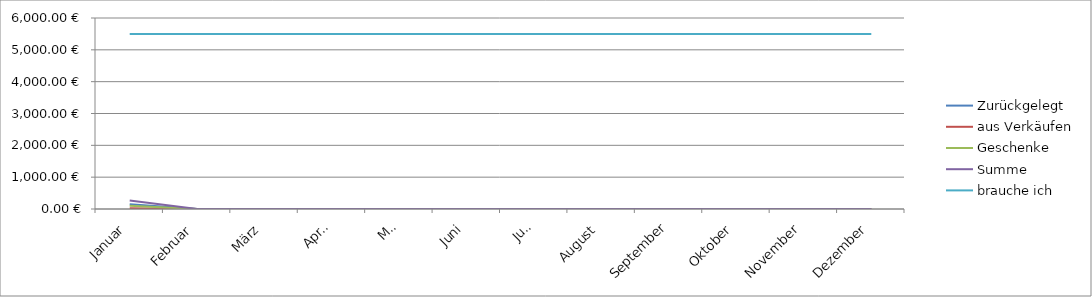
| Category | Zurückgelegt | aus Verkäufen | Geschenke | Summe | brauche ich |
|---|---|---|---|---|---|
| Januar | 150 | 20 | 100 | 270 | 5500 |
| Februar | 0 | 0 | 0 | 0 | 5500 |
| März | 0 | 0 | 0 | 0 | 5500 |
| April | 0 | 0 | 0 | 0 | 5500 |
| Mai | 0 | 0 | 0 | 0 | 5500 |
| Juni | 0 | 0 | 0 | 0 | 5500 |
| Juli | 0 | 0 | 0 | 0 | 5500 |
| August | 0 | 0 | 0 | 0 | 5500 |
| September | 0 | 0 | 0 | 0 | 5500 |
| Oktober | 0 | 0 | 0 | 0 | 5500 |
| November | 0 | 0 | 0 | 0 | 5500 |
| Dezember | 0 | 0 | 0 | 0 | 5500 |